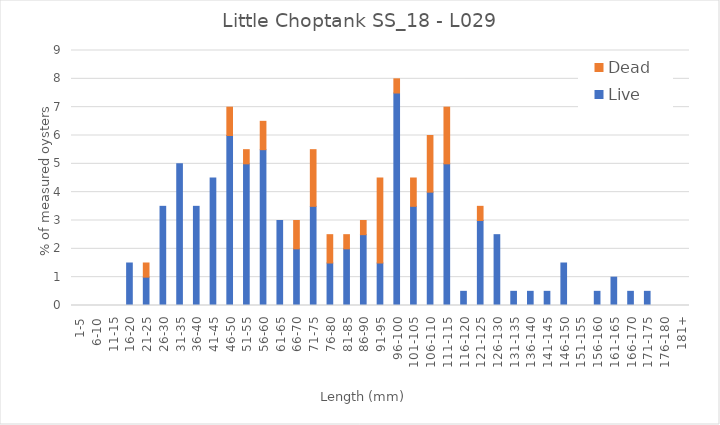
| Category | Live | Dead |
|---|---|---|
| 1-5 | 0 | 0 |
| 6-10 | 0 | 0 |
| 11-15 | 0 | 0 |
| 16-20 | 1.5 | 0 |
| 21-25 | 1 | 0.5 |
| 26-30 | 3.5 | 0 |
| 31-35 | 5 | 0 |
| 36-40 | 3.5 | 0 |
| 41-45 | 4.5 | 0 |
| 46-50 | 6 | 1 |
| 51-55 | 5 | 0.5 |
| 56-60 | 5.5 | 1 |
| 61-65 | 3 | 0 |
| 66-70 | 2 | 1 |
| 71-75 | 3.5 | 2 |
| 76-80 | 1.5 | 1 |
| 81-85 | 2 | 0.5 |
| 86-90 | 2.5 | 0.5 |
| 91-95 | 1.5 | 3 |
| 96-100 | 7.5 | 0.5 |
| 101-105 | 3.5 | 1 |
| 106-110 | 4 | 2 |
| 111-115 | 5 | 2 |
| 116-120 | 0.5 | 0 |
| 121-125 | 3 | 0.5 |
| 126-130 | 2.5 | 0 |
| 131-135 | 0.5 | 0 |
| 136-140 | 0.5 | 0 |
| 141-145 | 0.5 | 0 |
| 146-150 | 1.5 | 0 |
| 151-155 | 0 | 0 |
| 156-160 | 0.5 | 0 |
| 161-165 | 1 | 0 |
| 166-170 | 0.5 | 0 |
| 171-175 | 0.5 | 0 |
| 176-180 | 0 | 0 |
| 181+ | 0 | 0 |